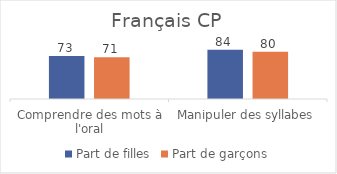
| Category | Part de filles | Part de garçons |
|---|---|---|
| Comprendre des mots à l'oral | 72.84 | 70.76 |
| Manipuler des syllabes | 83.66 | 79.96 |